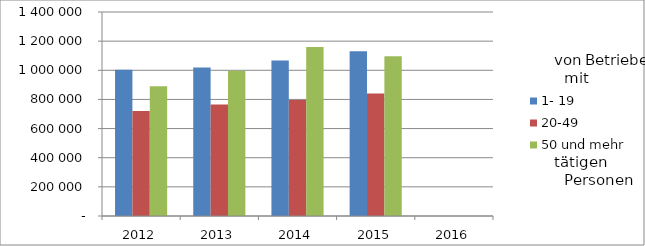
| Category | 1- 19 | 20-49 | 50 und mehr |
|---|---|---|---|
| 2012.0 | 1004481.951 | 720973.916 | 889638.846 |
| 2013.0 | 1018644.471 | 765877.932 | 997407.657 |
| 2014.0 | 1067719.672 | 796122.546 | 1160478.917 |
| 2015.0 | 1131201.579 | 841056.256 | 1095904.136 |
| 2016.0 | 0 | 0 | 0 |